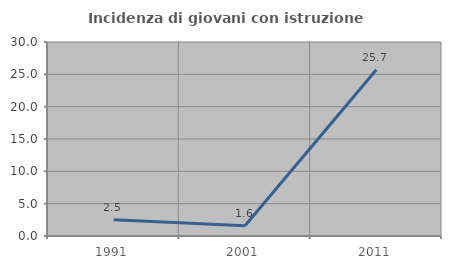
| Category | Incidenza di giovani con istruzione universitaria |
|---|---|
| 1991.0 | 2.5 |
| 2001.0 | 1.587 |
| 2011.0 | 25.714 |